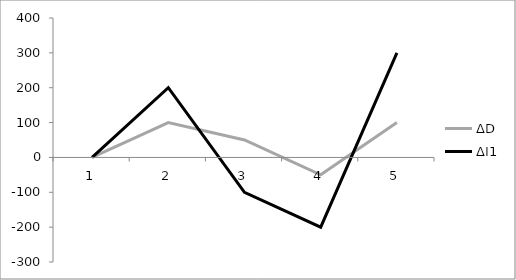
| Category | ΔD | ΔI1 |
|---|---|---|
| 0 | 0 | 0 |
| 1 | 100 | 200 |
| 2 | 50 | -100 |
| 3 | -50 | -200 |
| 4 | 100 | 300 |